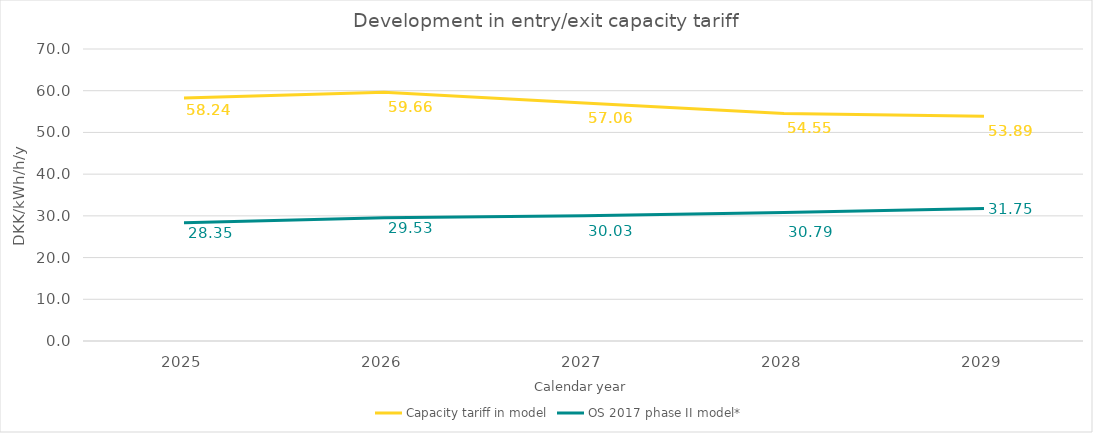
| Category | Capacity tariff in model | OS 2017 phase II model* |
|---|---|---|
| 2025.0 | 58.237 | 28.349 |
| 2026.0 | 59.661 | 29.527 |
| 2027.0 | 57.06 | 30.033 |
| 2028.0 | 54.545 | 30.794 |
| 2029.0 | 53.894 | 31.747 |